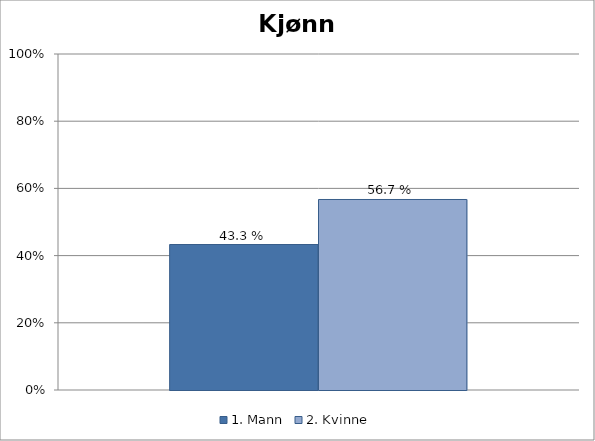
| Category | 1. Mann | 2. Kvinne |
|---|---|---|
| Kjønn | 0.433 | 0.567 |